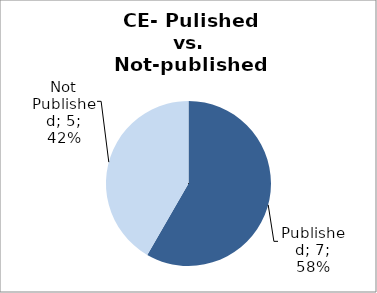
| Category | Series 0 |
|---|---|
| Published | 7 |
| Not Published | 5 |